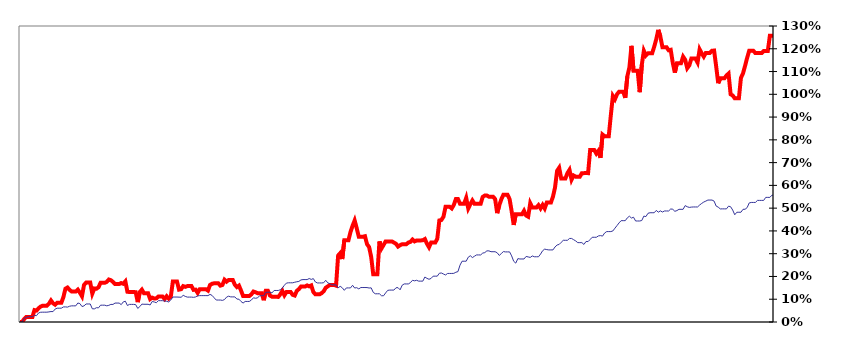
| Category | Series 0 |
|---|---|
| 31/12/2012 | 0 |
| 01/01/2013 | 0 |
| 02/01/2013 | 0.013 |
| 03/01/2013 | 0.022 |
| 04/01/2013 | 0.022 |
| 05/01/2013 | 0.022 |
| 06/01/2013 | 0.022 |
| 07/01/2013 | 0.052 |
| 08/01/2013 | 0.05 |
| 09/01/2013 | 0.06 |
| 10/01/2013 | 0.068 |
| 11/01/2013 | 0.072 |
| 12/01/2013 | 0.072 |
| 13/01/2013 | 0.072 |
| 14/01/2013 | 0.08 |
| 15/01/2013 | 0.095 |
| 16/01/2013 | 0.082 |
| 17/01/2013 | 0.076 |
| 18/01/2013 | 0.084 |
| 19/01/2013 | 0.084 |
| 20/01/2013 | 0.084 |
| 21/01/2013 | 0.109 |
| 22/01/2013 | 0.146 |
| 23/01/2013 | 0.151 |
| 24/01/2013 | 0.141 |
| 25/01/2013 | 0.134 |
| 26/01/2013 | 0.134 |
| 27/01/2013 | 0.134 |
| 28/01/2013 | 0.142 |
| 29/01/2013 | 0.129 |
| 30/01/2013 | 0.113 |
| 31/01/2013 | 0.163 |
| 01/02/2013 | 0.173 |
| 02/02/2013 | 0.173 |
| 03/02/2013 | 0.173 |
| 04/02/2013 | 0.125 |
| 05/02/2013 | 0.147 |
| 06/02/2013 | 0.146 |
| 07/02/2013 | 0.152 |
| 08/02/2013 | 0.172 |
| 09/02/2013 | 0.172 |
| 10/02/2013 | 0.172 |
| 11/02/2013 | 0.176 |
| 12/02/2013 | 0.187 |
| 13/02/2013 | 0.183 |
| 14/02/2013 | 0.176 |
| 15/02/2013 | 0.167 |
| 16/02/2013 | 0.167 |
| 17/02/2013 | 0.167 |
| 18/02/2013 | 0.171 |
| 19/02/2013 | 0.168 |
| 20/02/2013 | 0.178 |
| 21/02/2013 | 0.133 |
| 22/02/2013 | 0.132 |
| 23/02/2013 | 0.132 |
| 24/02/2013 | 0.132 |
| 25/02/2013 | 0.131 |
| 26/02/2013 | 0.087 |
| 27/02/2013 | 0.132 |
| 28/02/2013 | 0.142 |
| 01/03/2013 | 0.127 |
| 02/03/2013 | 0.127 |
| 03/03/2013 | 0.127 |
| 04/03/2013 | 0.101 |
| 05/03/2013 | 0.107 |
| 06/03/2013 | 0.103 |
| 07/03/2013 | 0.104 |
| 08/03/2013 | 0.112 |
| 09/03/2013 | 0.112 |
| 10/03/2013 | 0.112 |
| 11/03/2013 | 0.101 |
| 12/03/2013 | 0.113 |
| 13/03/2013 | 0.103 |
| 14/03/2013 | 0.111 |
| 15/03/2013 | 0.178 |
| 16/03/2013 | 0.178 |
| 17/03/2013 | 0.178 |
| 18/03/2013 | 0.142 |
| 19/03/2013 | 0.144 |
| 20/03/2013 | 0.158 |
| 21/03/2013 | 0.155 |
| 22/03/2013 | 0.158 |
| 23/03/2013 | 0.158 |
| 24/03/2013 | 0.158 |
| 25/03/2013 | 0.141 |
| 26/03/2013 | 0.142 |
| 27/03/2013 | 0.128 |
| 28/03/2013 | 0.144 |
| 29/03/2013 | 0.144 |
| 30/03/2013 | 0.144 |
| 31/03/2013 | 0.144 |
| 01/04/2013 | 0.138 |
| 02/04/2013 | 0.163 |
| 03/04/2013 | 0.168 |
| 04/04/2013 | 0.17 |
| 05/04/2013 | 0.17 |
| 06/04/2013 | 0.17 |
| 07/04/2013 | 0.16 |
| 08/04/2013 | 0.163 |
| 09/04/2013 | 0.186 |
| 10/04/2013 | 0.177 |
| 11/04/2013 | 0.184 |
| 12/04/2013 | 0.184 |
| 13/04/2013 | 0.184 |
| 14/04/2013 | 0.164 |
| 15/04/2013 | 0.153 |
| 16/04/2013 | 0.16 |
| 17/04/2013 | 0.138 |
| 18/04/2013 | 0.114 |
| 19/04/2013 | 0.114 |
| 20/04/2013 | 0.114 |
| 21/04/2013 | 0.114 |
| 22/04/2013 | 0.121 |
| 23/04/2013 | 0.134 |
| 24/04/2013 | 0.131 |
| 25/04/2013 | 0.127 |
| 26/04/2013 | 0.127 |
| 27/04/2013 | 0.127 |
| 28/04/2013 | 0.096 |
| 29/04/2013 | 0.137 |
| 30/04/2013 | 0.137 |
| 01/05/2013 | 0.116 |
| 02/05/2013 | 0.111 |
| 03/05/2013 | 0.111 |
| 04/05/2013 | 0.111 |
| 05/05/2013 | 0.11 |
| 06/05/2013 | 0.121 |
| 07/05/2013 | 0.137 |
| 08/05/2013 | 0.117 |
| 09/05/2013 | 0.132 |
| 10/05/2013 | 0.132 |
| 11/05/2013 | 0.132 |
| 12/05/2013 | 0.119 |
| 13/05/2013 | 0.116 |
| 14/05/2013 | 0.137 |
| 15/05/2013 | 0.144 |
| 16/05/2013 | 0.156 |
| 17/05/2013 | 0.156 |
| 18/05/2013 | 0.156 |
| 19/05/2013 | 0.161 |
| 20/05/2013 | 0.157 |
| 21/05/2013 | 0.161 |
| 22/05/2013 | 0.132 |
| 23/05/2013 | 0.121 |
| 24/05/2013 | 0.121 |
| 25/05/2013 | 0.121 |
| 26/05/2013 | 0.127 |
| 27/05/2013 | 0.135 |
| 28/05/2013 | 0.15 |
| 29/05/2013 | 0.157 |
| 30/05/2013 | 0.163 |
| 31/05/2013 | 0.163 |
| 01/06/2013 | 0.163 |
| 02/06/2013 | 0.16 |
| 03/06/2013 | 0.292 |
| 04/06/2013 | 0.302 |
| 05/06/2013 | 0.276 |
| 06/06/2013 | 0.359 |
| 07/06/2013 | 0.359 |
| 08/06/2013 | 0.359 |
| 09/06/2013 | 0.395 |
| 10/06/2013 | 0.423 |
| 11/06/2013 | 0.446 |
| 12/06/2013 | 0.412 |
| 13/06/2013 | 0.375 |
| 14/06/2013 | 0.375 |
| 15/06/2013 | 0.375 |
| 16/06/2013 | 0.377 |
| 17/06/2013 | 0.342 |
| 18/06/2013 | 0.329 |
| 19/06/2013 | 0.286 |
| 20/06/2013 | 0.209 |
| 21/06/2013 | 0.209 |
| 22/06/2013 | 0.209 |
| 23/06/2013 | 0.354 |
| 24/06/2013 | 0.323 |
| 25/06/2013 | 0.339 |
| 26/06/2013 | 0.354 |
| 27/06/2013 | 0.354 |
| 28/06/2013 | 0.354 |
| 29/06/2013 | 0.354 |
| 30/06/2013 | 0.349 |
| 01/07/2013 | 0.344 |
| 02/07/2013 | 0.331 |
| 03/07/2013 | 0.337 |
| 04/07/2013 | 0.342 |
| 05/07/2013 | 0.342 |
| 06/07/2013 | 0.342 |
| 07/07/2013 | 0.349 |
| 08/07/2013 | 0.352 |
| 09/07/2013 | 0.362 |
| 10/07/2013 | 0.354 |
| 11/07/2013 | 0.358 |
| 12/07/2013 | 0.358 |
| 13/07/2013 | 0.358 |
| 14/07/2013 | 0.359 |
| 15/07/2013 | 0.364 |
| 16/07/2013 | 0.344 |
| 17/07/2013 | 0.328 |
| 18/07/2013 | 0.349 |
| 19/07/2013 | 0.349 |
| 20/07/2013 | 0.349 |
| 21/07/2013 | 0.365 |
| 22/07/2013 | 0.446 |
| 23/07/2013 | 0.448 |
| 24/07/2013 | 0.463 |
| 25/07/2013 | 0.506 |
| 26/07/2013 | 0.506 |
| 27/07/2013 | 0.506 |
| 28/07/2013 | 0.499 |
| 29/07/2013 | 0.514 |
| 30/07/2013 | 0.54 |
| 31/07/2013 | 0.54 |
| 01/08/2013 | 0.519 |
| 02/08/2013 | 0.519 |
| 03/08/2013 | 0.519 |
| 04/08/2013 | 0.545 |
| 05/08/2013 | 0.499 |
| 06/08/2013 | 0.517 |
| 07/08/2013 | 0.534 |
| 08/08/2013 | 0.519 |
| 09/08/2013 | 0.519 |
| 10/08/2013 | 0.519 |
| 11/08/2013 | 0.519 |
| 12/08/2013 | 0.549 |
| 13/08/2013 | 0.556 |
| 14/08/2013 | 0.556 |
| 15/08/2013 | 0.55 |
| 16/08/2013 | 0.55 |
| 17/08/2013 | 0.55 |
| 18/08/2013 | 0.54 |
| 19/08/2013 | 0.478 |
| 20/08/2013 | 0.512 |
| 21/08/2013 | 0.539 |
| 22/08/2013 | 0.559 |
| 23/08/2013 | 0.559 |
| 24/08/2013 | 0.559 |
| 25/08/2013 | 0.54 |
| 26/08/2013 | 0.486 |
| 27/08/2013 | 0.426 |
| 28/08/2013 | 0.473 |
| 29/08/2013 | 0.473 |
| 30/08/2013 | 0.473 |
| 31/08/2013 | 0.473 |
| 01/09/2013 | 0.488 |
| 02/09/2013 | 0.468 |
| 03/09/2013 | 0.463 |
| 04/09/2013 | 0.521 |
| 05/09/2013 | 0.503 |
| 06/09/2013 | 0.503 |
| 07/09/2013 | 0.503 |
| 08/09/2013 | 0.513 |
| 09/09/2013 | 0.499 |
| 10/09/2013 | 0.514 |
| 11/09/2013 | 0.499 |
| 12/09/2013 | 0.525 |
| 13/09/2013 | 0.525 |
| 14/09/2013 | 0.525 |
| 15/09/2013 | 0.55 |
| 16/09/2013 | 0.591 |
| 17/09/2013 | 0.664 |
| 18/09/2013 | 0.678 |
| 19/09/2013 | 0.63 |
| 20/09/2013 | 0.63 |
| 21/09/2013 | 0.63 |
| 22/09/2013 | 0.654 |
| 23/09/2013 | 0.668 |
| 24/09/2013 | 0.625 |
| 25/09/2013 | 0.643 |
| 26/09/2013 | 0.638 |
| 27/09/2013 | 0.638 |
| 28/09/2013 | 0.638 |
| 29/09/2013 | 0.654 |
| 30/09/2013 | 0.654 |
| 01/10/2013 | 0.655 |
| 02/10/2013 | 0.654 |
| 03/10/2013 | 0.755 |
| 04/10/2013 | 0.755 |
| 05/10/2013 | 0.755 |
| 06/10/2013 | 0.74 |
| 07/10/2013 | 0.752 |
| 08/10/2013 | 0.721 |
| 09/10/2013 | 0.823 |
| 10/10/2013 | 0.816 |
| 11/10/2013 | 0.816 |
| 12/10/2013 | 0.816 |
| 13/10/2013 | 0.907 |
| 14/10/2013 | 0.993 |
| 15/10/2013 | 0.978 |
| 16/10/2013 | 1 |
| 17/10/2013 | 1.011 |
| 18/10/2013 | 1.011 |
| 19/10/2013 | 1.011 |
| 20/10/2013 | 0.984 |
| 21/10/2013 | 1.079 |
| 22/10/2013 | 1.118 |
| 23/10/2013 | 1.213 |
| 24/10/2013 | 1.103 |
| 25/10/2013 | 1.103 |
| 26/10/2013 | 1.103 |
| 27/10/2013 | 1.009 |
| 28/10/2013 | 1.129 |
| 29/10/2013 | 1.191 |
| 30/10/2013 | 1.171 |
| 31/10/2013 | 1.18 |
| 01/11/2013 | 1.18 |
| 02/11/2013 | 1.18 |
| 03/11/2013 | 1.209 |
| 04/11/2013 | 1.242 |
| 05/11/2013 | 1.283 |
| 06/11/2013 | 1.253 |
| 07/11/2013 | 1.207 |
| 08/11/2013 | 1.207 |
| 09/11/2013 | 1.207 |
| 10/11/2013 | 1.193 |
| 11/11/2013 | 1.195 |
| 12/11/2013 | 1.139 |
| 13/11/2013 | 1.095 |
| 14/11/2013 | 1.136 |
| 15/11/2013 | 1.136 |
| 16/11/2013 | 1.136 |
| 17/11/2013 | 1.165 |
| 18/11/2013 | 1.152 |
| 19/11/2013 | 1.115 |
| 20/11/2013 | 1.127 |
| 21/11/2013 | 1.157 |
| 22/11/2013 | 1.157 |
| 23/11/2013 | 1.157 |
| 24/11/2013 | 1.14 |
| 25/11/2013 | 1.197 |
| 26/11/2013 | 1.18 |
| 27/11/2013 | 1.165 |
| 28/11/2013 | 1.182 |
| 29/11/2013 | 1.182 |
| 30/11/2013 | 1.182 |
| 01/12/2013 | 1.191 |
| 02/12/2013 | 1.192 |
| 03/12/2013 | 1.123 |
| 04/12/2013 | 1.049 |
| 05/12/2013 | 1.07 |
| 06/12/2013 | 1.07 |
| 07/12/2013 | 1.07 |
| 08/12/2013 | 1.083 |
| 09/12/2013 | 1.091 |
| 10/12/2013 | 1 |
| 11/12/2013 | 0.995 |
| 12/12/2013 | 0.982 |
| 13/12/2013 | 0.982 |
| 14/12/2013 | 0.982 |
| 15/12/2013 | 1.072 |
| 16/12/2013 | 1.092 |
| 17/12/2013 | 1.125 |
| 18/12/2013 | 1.16 |
| 19/12/2013 | 1.191 |
| 20/12/2013 | 1.191 |
| 21/12/2013 | 1.191 |
| 22/12/2013 | 1.181 |
| 23/12/2013 | 1.181 |
| 24/12/2013 | 1.181 |
| 25/12/2013 | 1.181 |
| 26/12/2013 | 1.19 |
| 27/12/2013 | 1.19 |
| 28/12/2013 | 1.19 |
| 29/12/2013 | 1.257 |
| 30/12/2013 | 1.257 |
| 31/12/2013 | 1.257 |